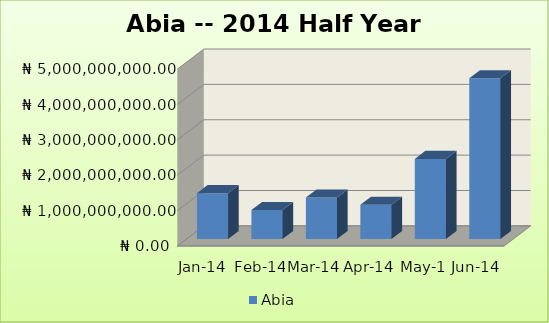
| Category | Abia |
|---|---|
| Jan-14 | 1297498300 |
| Feb-14 | 821123500 |
| Mar-14 | 1175454800 |
| Apr-14 | 967327400 |
| May-14 | 2265644000 |
| Jun-14 | 4544916100 |